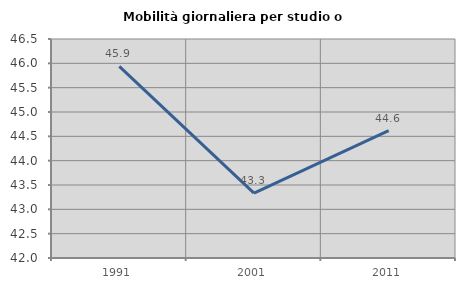
| Category | Mobilità giornaliera per studio o lavoro |
|---|---|
| 1991.0 | 45.937 |
| 2001.0 | 43.335 |
| 2011.0 | 44.615 |